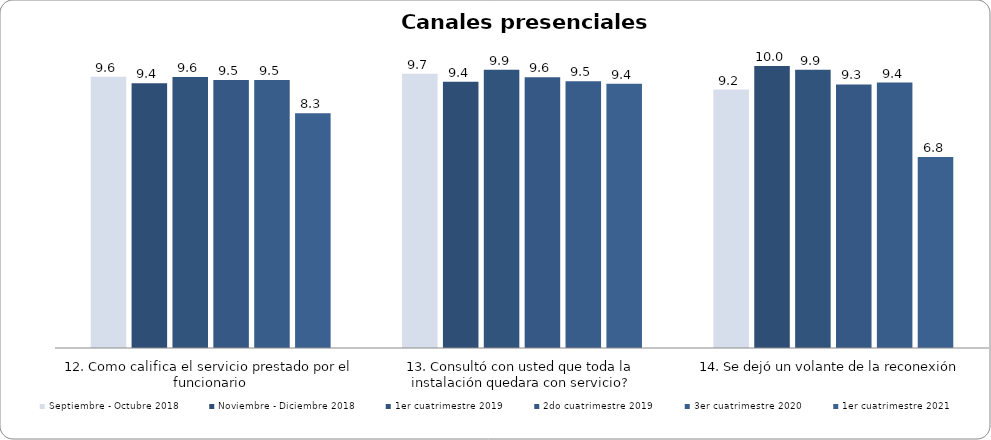
| Category | Septiembre - Octubre 2018 | Noviembre - Diciembre 2018 | 1er cuatrimestre 2019 | 2do cuatrimestre 2019 | 3er cuatrimestre 2020 | 1er cuatrimestre 2021 |
|---|---|---|---|---|---|---|
| 12. Como califica el servicio prestado por el funcionario | 9.616 | 9.389 | 9.608 | 9.5 | 9.5 | 8.321 |
| 13. Consultó con usted que toda la instalación quedara con servicio? | 9.726 | 9.444 | 9.865 | 9.604 | 9.459 | 9.375 |
| 14. Se dejó un volante de la reconexión | 9.167 | 10 | 9.865 | 9.348 | 9.412 | 6.774 |